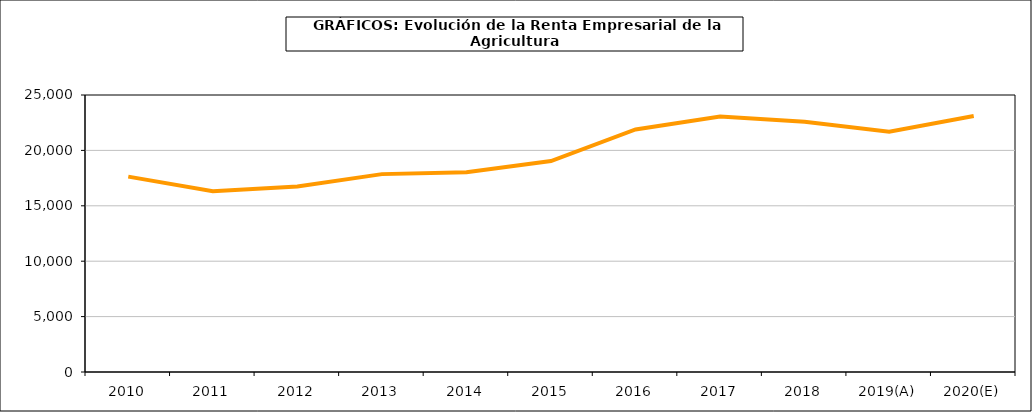
| Category | renta empresarial |
|---|---|
| 2010 | 17633.246 |
| 2011 | 16322.948 |
| 2012 | 16739.148 |
| 2013 | 17858.951 |
| 2014 | 18029.917 |
| 2015 | 19041.49 |
| 2016 | 21888.067 |
| 2017 | 23056.94 |
| 2018 | 22591.942 |
| 2019(A) | 21678.317 |
| 2020(E) | 23100.177 |